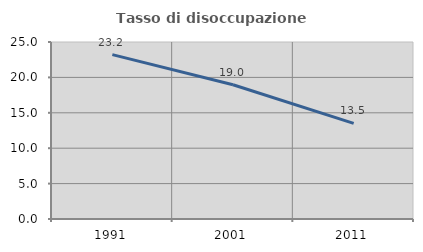
| Category | Tasso di disoccupazione giovanile  |
|---|---|
| 1991.0 | 23.214 |
| 2001.0 | 18.966 |
| 2011.0 | 13.514 |